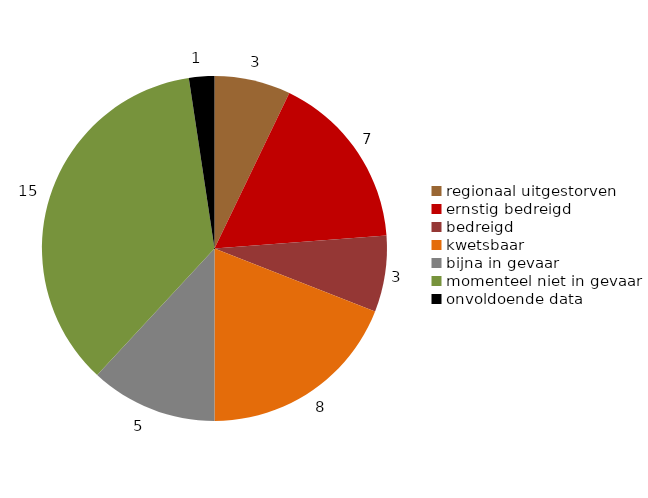
| Category | Series 0 |
|---|---|
| regionaal uitgestorven | 3 |
| ernstig bedreigd | 7 |
| bedreigd | 3 |
| kwetsbaar | 8 |
| bijna in gevaar | 5 |
| momenteel niet in gevaar | 15 |
| onvoldoende data | 1 |